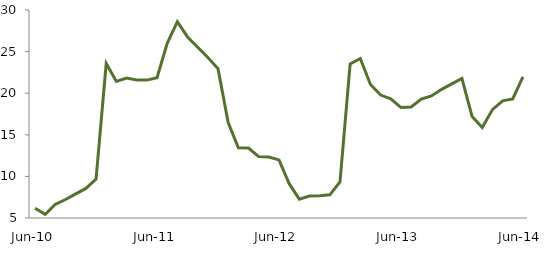
| Category | Series 0 |
|---|---|
| Jun-10 | 6.163 |
|  | 5.438 |
|  | 6.646 |
|  | 7.221 |
|  | 7.895 |
|  | 8.557 |
|  | 9.672 |
|  | 23.568 |
|  | 21.416 |
|  | 21.82 |
|  | 21.594 |
|  | 21.573 |
| Jun-11 | 21.858 |
|  | 26.004 |
|  | 28.598 |
|  | 26.763 |
|  | 25.524 |
|  | 24.297 |
|  | 22.953 |
|  | 16.468 |
|  | 13.439 |
|  | 13.403 |
|  | 12.375 |
|  | 12.322 |
| Jun-12 | 11.984 |
|  | 9.127 |
|  | 7.263 |
|  | 7.639 |
|  | 7.67 |
|  | 7.782 |
|  | 9.348 |
|  | 23.527 |
|  | 24.167 |
|  | 21.04 |
|  | 19.779 |
|  | 19.32 |
| Jun-13 | 18.279 |
|  | 18.336 |
|  | 19.291 |
|  | 19.663 |
|  | 20.461 |
|  | 21.118 |
|  | 21.766 |
|  | 17.185 |
|  | 15.873 |
|  | 18.029 |
|  | 19.087 |
|  | 19.316 |
| Jun-14 | 21.967 |